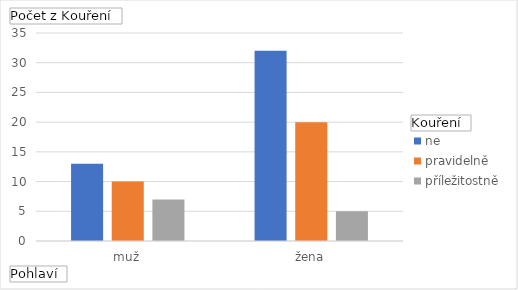
| Category | ne | pravidelně | příležitostně |
|---|---|---|---|
| muž | 13 | 10 | 7 |
| žena | 32 | 20 | 5 |